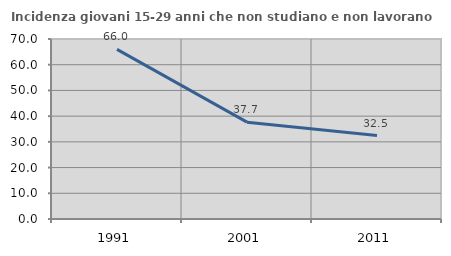
| Category | Incidenza giovani 15-29 anni che non studiano e non lavorano  |
|---|---|
| 1991.0 | 65.966 |
| 2001.0 | 37.658 |
| 2011.0 | 32.456 |